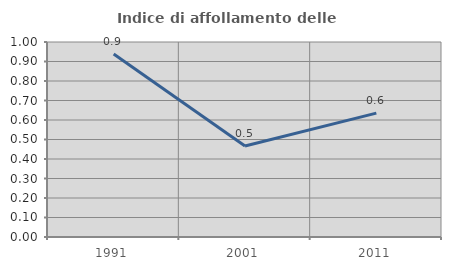
| Category | Indice di affollamento delle abitazioni  |
|---|---|
| 1991.0 | 0.938 |
| 2001.0 | 0.466 |
| 2011.0 | 0.635 |